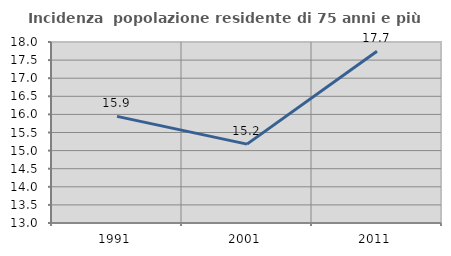
| Category | Incidenza  popolazione residente di 75 anni e più |
|---|---|
| 1991.0 | 15.945 |
| 2001.0 | 15.179 |
| 2011.0 | 17.745 |